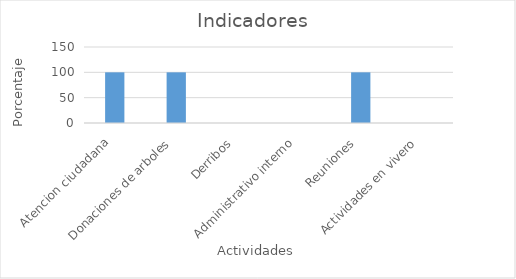
| Category | porcentaje  |
|---|---|
| Atencion ciudadana  | 100 |
| Donaciones de arboles  | 100 |
| Derribos  | 0 |
| Administrativo interno  | 0 |
| Reuniones  | 100 |
| Actividades en vivero  | 0 |